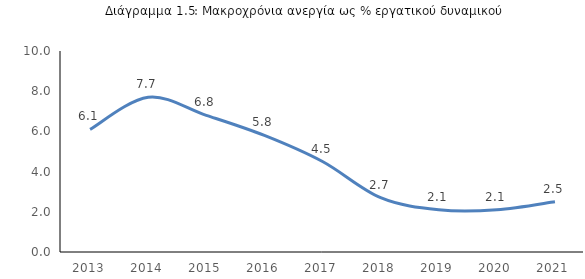
| Category |  >12 μήνες/εργατικό δυναμικό % |
|---|---|
| 2013.0 | 6.1 |
| 2014.0 | 7.7 |
| 2015.0 | 6.8 |
| 2016.0 | 5.8 |
| 2017.0 | 4.5 |
| 2018.0 | 2.7 |
| 2019.0 | 2.1 |
| 2020.0 | 2.1 |
| 2021.0 | 2.5 |